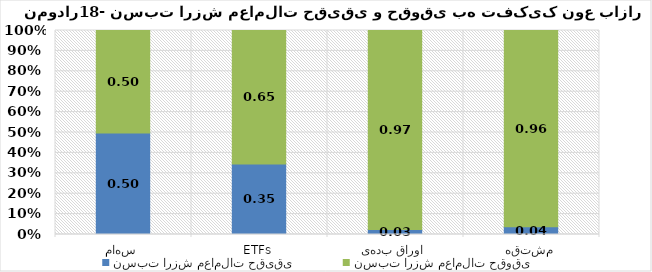
| Category | نسبت ارزش معاملات حقیقی | نسبت ارزش معاملات حقوقی |
|---|---|---|
| سهام | 0.497 | 0.503 |
| ETFs | 0.345 | 0.655 |
| اوراق بدهی | 0.025 | 0.975 |
| مشتقه | 0.039 | 0.961 |